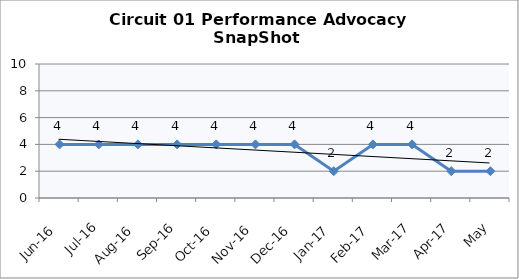
| Category | Circuit 01 |
|---|---|
| Jun-16 | 4 |
| Jul-16 | 4 |
| Aug-16 | 4 |
| Sep-16 | 4 |
| Oct-16 | 4 |
| Nov-16 | 4 |
| Dec-16 | 4 |
| Jan-17 | 2 |
| Feb-17 | 4 |
| Mar-17 | 4 |
| Apr-17 | 2 |
| May | 2 |